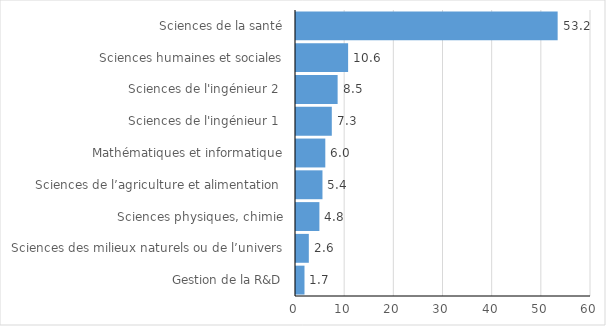
| Category | En % |
|---|---|
| Gestion de la R&D | 1.727 |
| Sciences des milieux naturels ou de l’univers | 2.608 |
| Sciences physiques, chimie | 4.758 |
| Sciences de l’agriculture et alimentation  | 5.384 |
| Mathématiques et informatique | 5.96 |
| Sciences de l'ingénieur 1  | 7.281 |
| Sciences de l'ingénieur 2  | 8.466 |
| Sciences humaines et sociales | 10.599 |
| Sciences de la santé | 53.217 |